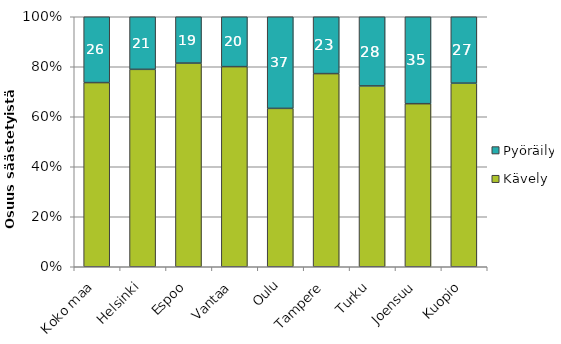
| Category | Kävely | Pyöräily |
|---|---|---|
| Koko maa | 23097.916 | 8257.476 |
| Helsinki | 3336.915 | 888.956 |
| Espoo | 1001.167 | 227.775 |
| Vantaa | 957.933 | 238.735 |
| Oulu | 696.287 | 402.815 |
| Tampere | 1253.425 | 368.977 |
| Turku | 898.146 | 343.383 |
| Joensuu | 412.386 | 219.862 |
| Kuopio | 451.444 | 163.251 |